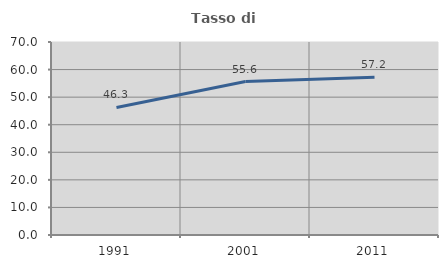
| Category | Tasso di occupazione   |
|---|---|
| 1991.0 | 46.269 |
| 2001.0 | 55.641 |
| 2011.0 | 57.185 |